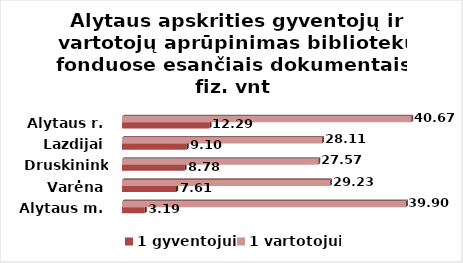
| Category | 1 gyventojui | 1 vartotojui |
|---|---|---|
| Alytaus m. | 3.19 | 39.899 |
| Varėna | 7.61 | 29.234 |
| Druskininkai | 8.78 | 27.574 |
| Lazdijai | 9.1 | 28.106 |
| Alytaus r. | 12.29 | 40.666 |